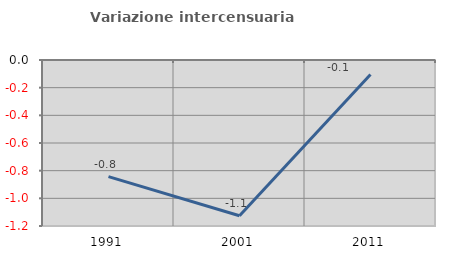
| Category | Variazione intercensuaria annua |
|---|---|
| 1991.0 | -0.843 |
| 2001.0 | -1.126 |
| 2011.0 | -0.105 |